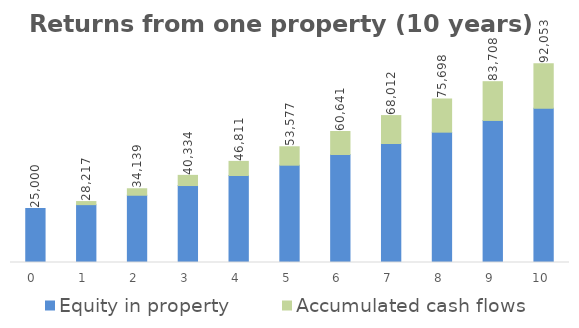
| Category | Equity in property  | Accumulated cash flows  | Total equity  |
|---|---|---|---|
| 0.0 | 25000 | 0 | 25000 |
| 1.0 | 26783.02 | 1434.308 | 28217.328 |
| 2.0 | 31138.182 | 3000.772 | 34138.954 |
| 3.0 | 35631.92 | 4702.405 | 40334.325 |
| 4.0 | 40268.402 | 6542.584 | 46810.987 |
| 5.0 | 45052.436 | 8524.668 | 53577.104 |
| 6.0 | 49988.998 | 10652.09 | 60641.088 |
| 7.0 | 55083.245 | 12928.362 | 68011.607 |
| 8.0 | 60340.513 | 15357.077 | 75697.591 |
| 9.0 | 65766.333 | 17941.909 | 83708.241 |
| 10.0 | 71366.429 | 20686.613 | 92053.042 |